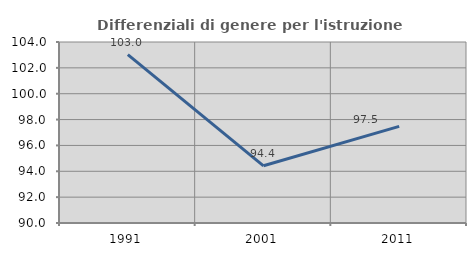
| Category | Differenziali di genere per l'istruzione superiore |
|---|---|
| 1991.0 | 103.03 |
| 2001.0 | 94.425 |
| 2011.0 | 97.471 |